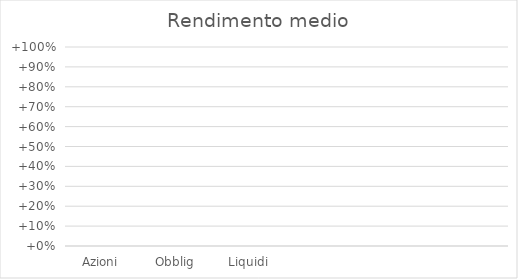
| Category | Rendimento medio |
|---|---|
| Azioni | 0 |
| Obblig | 0 |
| Liquidi | 0 |